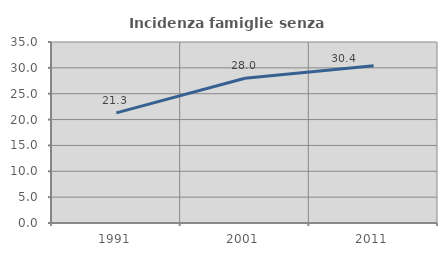
| Category | Incidenza famiglie senza nuclei |
|---|---|
| 1991.0 | 21.291 |
| 2001.0 | 27.978 |
| 2011.0 | 30.411 |